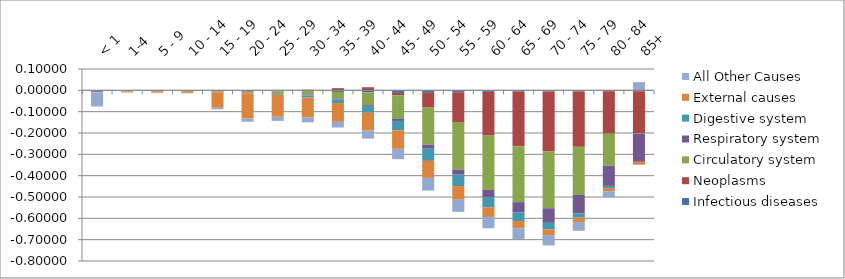
| Category | Infectious diseases  | Neoplasms | Circulatory system | Respiratory system  | Digestive system  | External causes  | All Other Causes |
|---|---|---|---|---|---|---|---|
| < 1 | -0.001 | 0 | -0.002 | -0.005 | -0.001 | -0.002 | -0.066 |
| 1-4 | -0.001 | -0.002 | 0 | -0.001 | -0.001 | -0.005 | 0 |
| 5 - 9 | 0 | -0.003 | -0.001 | 0 | 0 | -0.006 | -0.003 |
| 10 - 14 | 0 | -0.002 | -0.001 | 0 | 0 | -0.008 | -0.002 |
| 15 - 19 | -0.001 | -0.005 | -0.003 | -0.002 | 0 | -0.071 | -0.007 |
| 20 - 24 | 0 | -0.006 | -0.005 | -0.001 | -0.001 | -0.118 | -0.015 |
| 25 - 29 | -0.002 | -0.003 | -0.01 | -0.002 | -0.004 | -0.103 | -0.019 |
| 30 - 34 | -0.003 | 0.003 | -0.017 | -0.003 | -0.009 | -0.094 | -0.023 |
| 35 - 39 | -0.008 | 0.01 | -0.032 | -0.005 | -0.016 | -0.088 | -0.027 |
| 40 - 44 | -0.011 | 0.015 | -0.059 | -0.007 | -0.028 | -0.084 | -0.037 |
| 45 - 49 | -0.012 | -0.011 | -0.108 | -0.012 | -0.044 | -0.087 | -0.048 |
| 50 - 54 | -0.012 | -0.069 | -0.174 | -0.018 | -0.057 | -0.08 | -0.059 |
| 55 - 59 | -0.009 | -0.14 | -0.223 | -0.024 | -0.053 | -0.064 | -0.056 |
| 60 - 64 | -0.007 | -0.205 | -0.255 | -0.034 | -0.047 | -0.045 | -0.053 |
| 65 - 69 | -0.007 | -0.256 | -0.262 | -0.049 | -0.04 | -0.034 | -0.05 |
| 70 - 74 | -0.006 | -0.281 | -0.266 | -0.068 | -0.03 | -0.027 | -0.048 |
| 75 - 79 | -0.005 | -0.259 | -0.226 | -0.087 | -0.019 | -0.021 | -0.041 |
| 80 - 84 | -0.004 | -0.199 | -0.15 | -0.095 | -0.01 | -0.015 | -0.03 |
| 85+ | -0.004 | -0.197 | -0.002 | -0.131 | 0.001 | -0.014 | 0.038 |